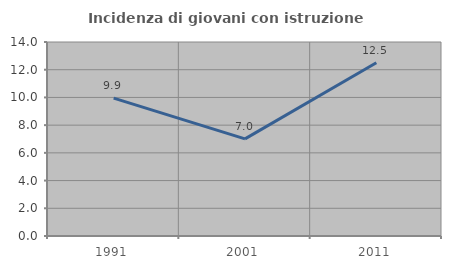
| Category | Incidenza di giovani con istruzione universitaria |
|---|---|
| 1991.0 | 9.948 |
| 2001.0 | 7.009 |
| 2011.0 | 12.5 |